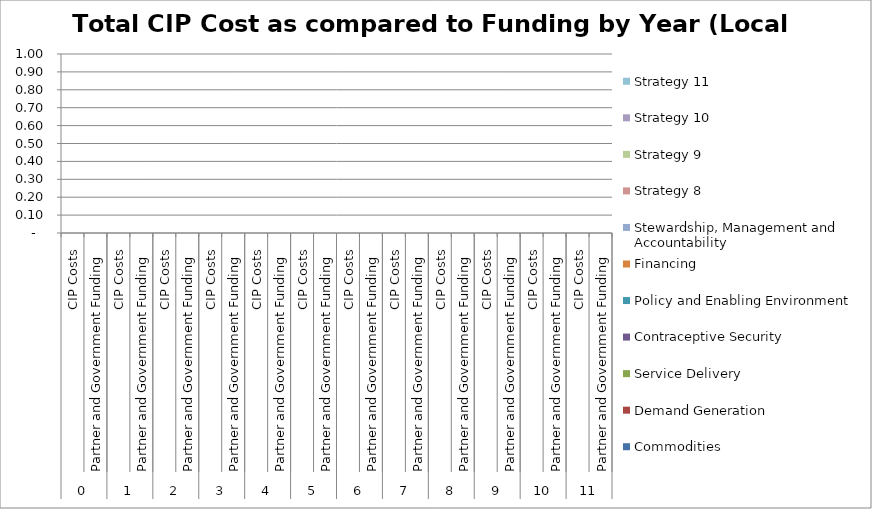
| Category | Commodities | Demand Generation | Service Delivery | Contraceptive Security | Policy and Enabling Environment | Financing | Stewardship, Management and Accountability | Strategy 8 | Strategy 9 | Strategy 10 | Strategy 11 |
|---|---|---|---|---|---|---|---|---|---|---|---|
| 0 | 0 | 0 | 0 | 0 | 0 | 0 | 0 | 0 | 0 | 0 | 0 |
| 1 | 0 | 0 | 0 | 0 | 0 | 0 | 0 | 0 | 0 | 0 | 0 |
| 2 | 0 | 0 | 0 | 0 | 0 | 0 | 0 | 0 | 0 | 0 | 0 |
| 3 | 0 | 0 | 0 | 0 | 0 | 0 | 0 | 0 | 0 | 0 | 0 |
| 4 | 0 | 0 | 0 | 0 | 0 | 0 | 0 | 0 | 0 | 0 | 0 |
| 5 | 0 | 0 | 0 | 0 | 0 | 0 | 0 | 0 | 0 | 0 | 0 |
| 6 | 0 | 0 | 0 | 0 | 0 | 0 | 0 | 0 | 0 | 0 | 0 |
| 7 | 0 | 0 | 0 | 0 | 0 | 0 | 0 | 0 | 0 | 0 | 0 |
| 8 | 0 | 0 | 0 | 0 | 0 | 0 | 0 | 0 | 0 | 0 | 0 |
| 9 | 0 | 0 | 0 | 0 | 0 | 0 | 0 | 0 | 0 | 0 | 0 |
| 10 | 0 | 0 | 0 | 0 | 0 | 0 | 0 | 0 | 0 | 0 | 0 |
| 11 | 0 | 0 | 0 | 0 | 0 | 0 | 0 | 0 | 0 | 0 | 0 |
| 12 | 0 | 0 | 0 | 0 | 0 | 0 | 0 | 0 | 0 | 0 | 0 |
| 13 | 0 | 0 | 0 | 0 | 0 | 0 | 0 | 0 | 0 | 0 | 0 |
| 14 | 0 | 0 | 0 | 0 | 0 | 0 | 0 | 0 | 0 | 0 | 0 |
| 15 | 0 | 0 | 0 | 0 | 0 | 0 | 0 | 0 | 0 | 0 | 0 |
| 16 | 0 | 0 | 0 | 0 | 0 | 0 | 0 | 0 | 0 | 0 | 0 |
| 17 | 0 | 0 | 0 | 0 | 0 | 0 | 0 | 0 | 0 | 0 | 0 |
| 18 | 0 | 0 | 0 | 0 | 0 | 0 | 0 | 0 | 0 | 0 | 0 |
| 19 | 0 | 0 | 0 | 0 | 0 | 0 | 0 | 0 | 0 | 0 | 0 |
| 20 | 0 | 0 | 0 | 0 | 0 | 0 | 0 | 0 | 0 | 0 | 0 |
| 21 | 0 | 0 | 0 | 0 | 0 | 0 | 0 | 0 | 0 | 0 | 0 |
| 22 | 0 | 0 | 0 | 0 | 0 | 0 | 0 | 0 | 0 | 0 | 0 |
| 23 | 0 | 0 | 0 | 0 | 0 | 0 | 0 | 0 | 0 | 0 | 0 |